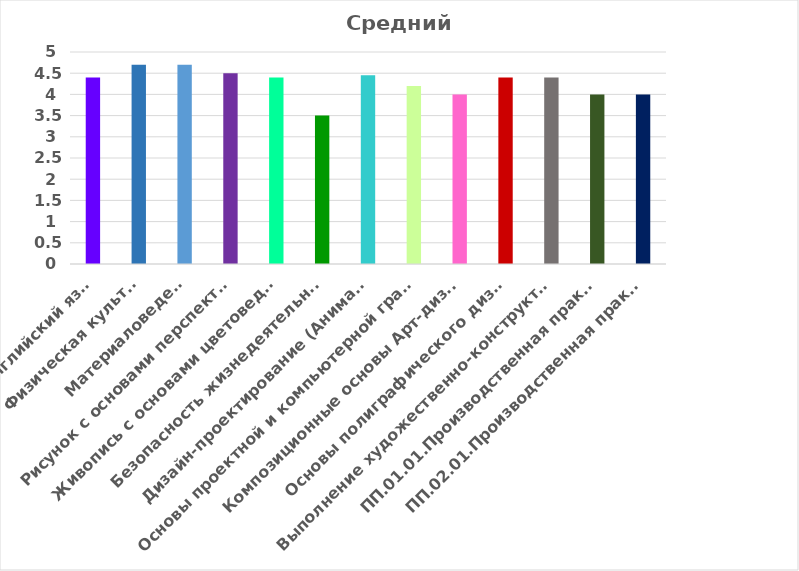
| Category | Средний балл |
|---|---|
| Английский язык | 4.4 |
| Физическая культура | 4.7 |
| Материаловедение | 4.7 |
| Рисунок с основами перспективы | 4.5 |
| Живопись с основами цветоведения | 4.4 |
| Безопасность жизнедеятельности | 3.5 |
| Дизайн-проектирование (Анимация) | 4.45 |
| Основы проектной и компьютерной графики | 4.2 |
| Композиционные основы Арт-дизайна | 4 |
| Основы полиграфического дизайна | 4.4 |
| Выполнение художественно-конструкторских проектов в материале | 4.4 |
| ПП.01.01.Производственная практика | 4 |
| ПП.02.01.Производственная практика | 4 |